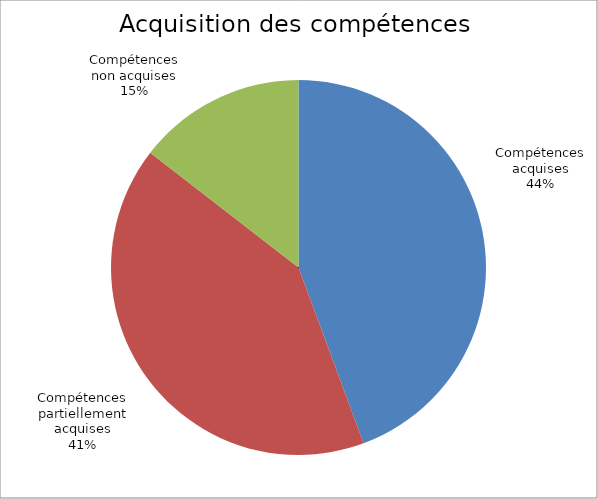
| Category | total compétences acquises | % |
|---|---|---|
| Compétences acquises | 55 | 0.444 |
| Compétences partiellement acquises | 51 | 0.411 |
| Compétences non acquises | 18 | 0.145 |